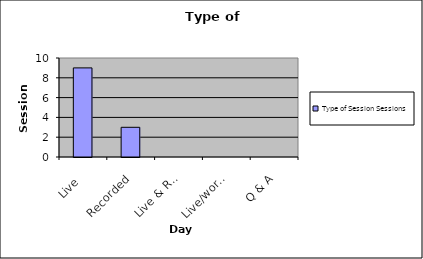
| Category | Type of Session |
|---|---|
| Live | 9 |
| Recorded | 3 |
| Live & Record. | 0 |
| Live/worksheet | 0 |
| Q & A | 0 |